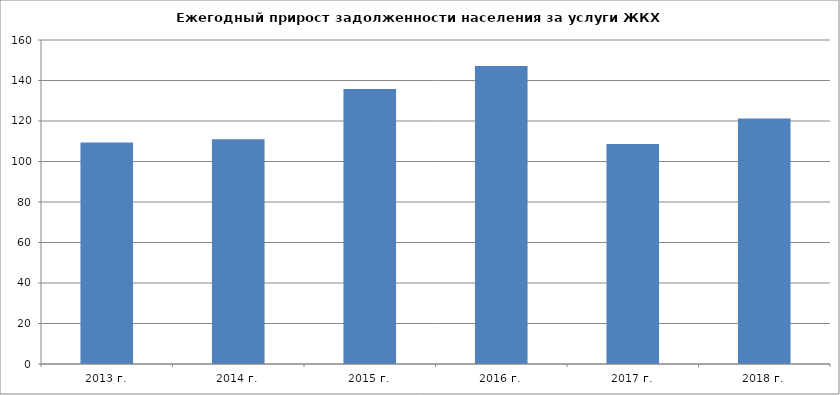
| Category | Ежегодный прирост задолженности населения за услуги ЖКХ (млрд руб.) |
|---|---|
| 2013 г. | 109.43 |
| 2014 г. | 111.04 |
| 2015 г. | 135.79 |
| 2016 г. | 147.1 |
| 2017 г. | 108.64 |
| 2018 г. | 121.22 |